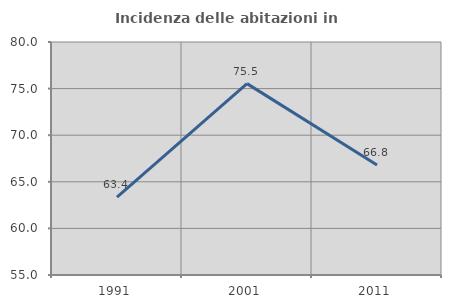
| Category | Incidenza delle abitazioni in proprietà  |
|---|---|
| 1991.0 | 63.358 |
| 2001.0 | 75.533 |
| 2011.0 | 66.81 |